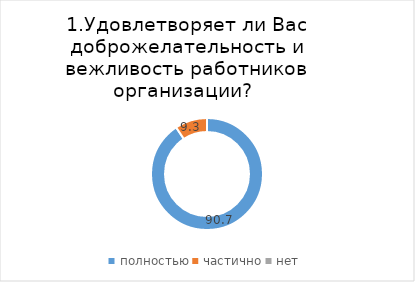
| Category | Молчановский |
|---|---|
| полностью | 90.698 |
| частично | 9.302 |
| нет | 0 |